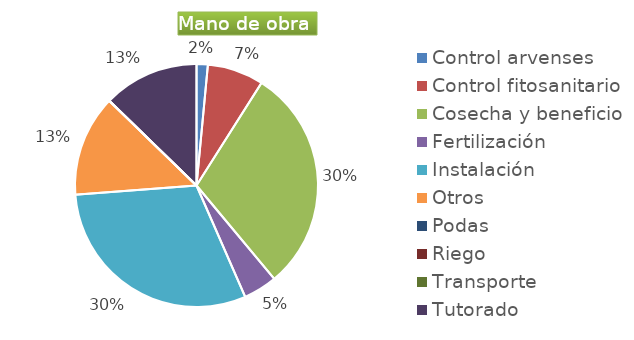
| Category | Series 0 |
|---|---|
| Control arvenses | 124632 |
| Control fitosanitario | 623160 |
| Cosecha y beneficio | 2492000 |
| Fertilización | 373896 |
| Instalación | 2524638 |
| Otros | 1121688 |
| Podas | 0 |
| Riego | 0 |
| Transporte | 0 |
| Tutorado | 1059372 |